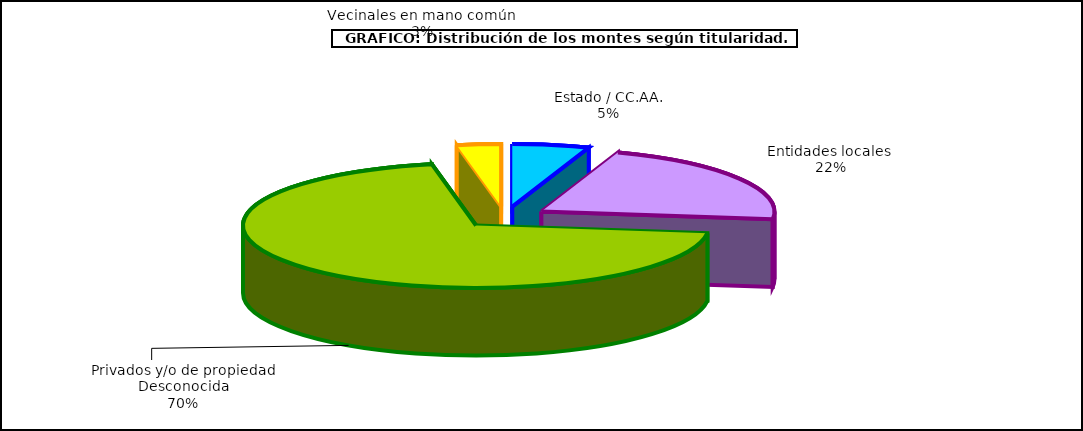
| Category | Series 0 |
|---|---|
| Estado / CC.AA. | 1468182.108 |
| Entidades locales  | 5971129.963 |
| Privados y/o de propiedad Desconocida | 19311452.806 |
| Vecinales en mano común  | 840754.683 |